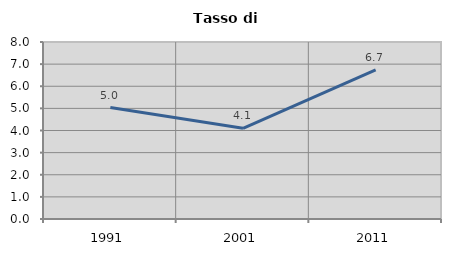
| Category | Tasso di disoccupazione   |
|---|---|
| 1991.0 | 5.035 |
| 2001.0 | 4.098 |
| 2011.0 | 6.736 |